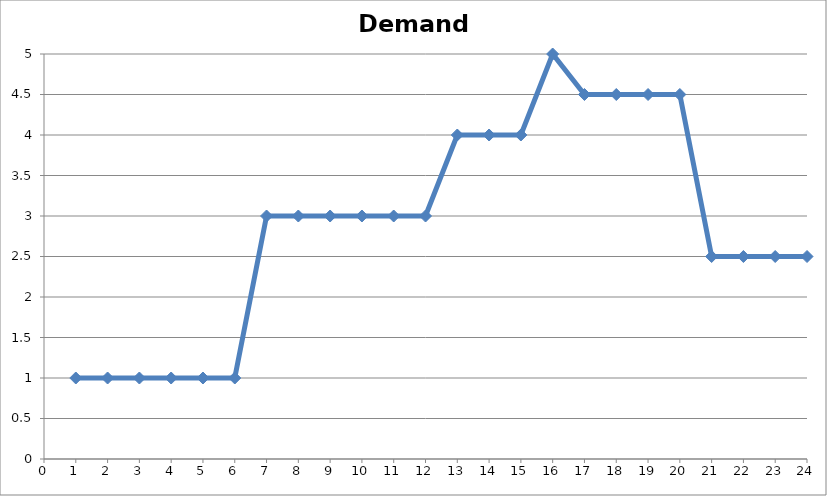
| Category | Demanda |
|---|---|
| 1.0 | 1 |
| 2.0 | 1 |
| 3.0 | 1 |
| 4.0 | 1 |
| 5.0 | 1 |
| 6.0 | 1 |
| 7.0 | 3 |
| 8.0 | 3 |
| 9.0 | 3 |
| 10.0 | 3 |
| 11.0 | 3 |
| 12.0 | 3 |
| 13.0 | 4 |
| 14.0 | 4 |
| 15.0 | 4 |
| 16.0 | 5 |
| 17.0 | 4.5 |
| 18.0 | 4.5 |
| 19.0 | 4.5 |
| 20.0 | 4.5 |
| 21.0 | 2.5 |
| 22.0 | 2.5 |
| 23.0 | 2.5 |
| 24.0 | 2.5 |